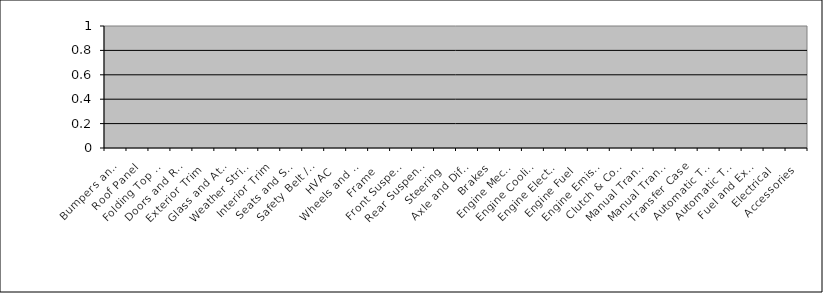
| Category | Series 0 |
|---|---|
| Bumpers and Front End | 0 |
| Roof Panel | 0 |
| Folding Top and Attaching Parts | 0 |
| Doors and Rear Compartment | 0 |
| Exterior Trim | 0 |
| Glass and Attaching Parts | 0 |
| Weather Strips | 0 |
| Interior Trim | 0 |
| Seats and Seat Trim | 0 |
| Safety Belt / Airbag Systems | 0 |
| HVAC | 0 |
| Wheels and Tires | 0 |
| Frame | 0 |
| Front Suspension | 0 |
| Rear Suspension | 0 |
| Steering | 0 |
| Axle and Differential | 0 |
| Brakes | 0 |
| Engine Mechanical | 0 |
| Engine Cooling | 0 |
| Engine Electrical | 0 |
| Engine Fuel | 0 |
| Engine Emission | 0 |
| Clutch & Controls | 0 |
| Manual Transmission Controls | 0 |
| Manual Transmission | 0 |
| Transfer Case | 0 |
| Automatic Trans Controls | 0 |
| Automatic Transaxle | 0 |
| Fuel and Exhaust | 0 |
| Electrical | 0 |
| Accessories | 0 |